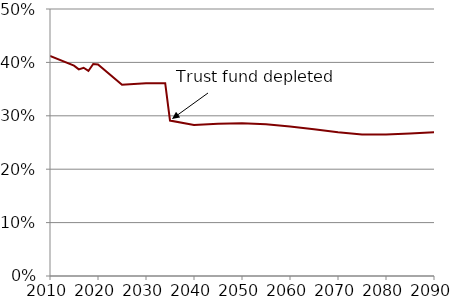
| Category | Series 1 |
|---|---|
| 2010.0 | 41.2 |
| 2015.0 | 39.4 |
| 2016.0 | 38.7 |
| 2017.0 | 39 |
| 2018.0 | 38.4 |
| 2019.0 | 39.7 |
| 2020.0 | 39.6 |
| 2025.0 | 35.8 |
| 2030.0 | 36.1 |
| 2031.0 | 36.1 |
| 2032.0 | 36.1 |
| 2033.0 | 36.1 |
| 2034.0 | 36.1 |
| 2035.0 | 29.1 |
| 2040.0 | 28.3 |
| 2045.0 | 28.5 |
| 2050.0 | 28.6 |
| 2055.0 | 28.4 |
| 2060.0 | 28 |
| 2065.0 | 27.5 |
| 2070.0 | 26.9 |
| 2075.0 | 26.5 |
| 2080.0 | 26.5 |
| 2085.0 | 26.7 |
| 2090.0 | 26.9 |
| 2095.0 | 26.9 |